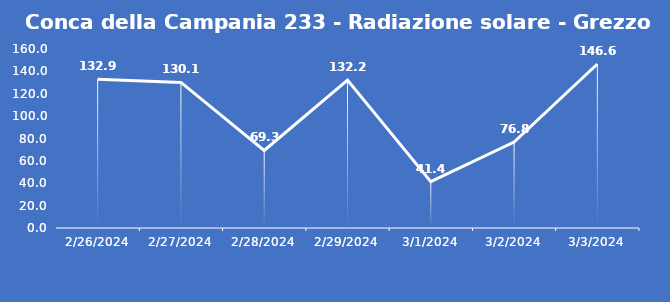
| Category | Conca della Campania 233 - Radiazione solare - Grezzo (W/m2) |
|---|---|
| 2/26/24 | 132.9 |
| 2/27/24 | 130.1 |
| 2/28/24 | 69.3 |
| 2/29/24 | 132.2 |
| 3/1/24 | 41.4 |
| 3/2/24 | 76.8 |
| 3/3/24 | 146.6 |